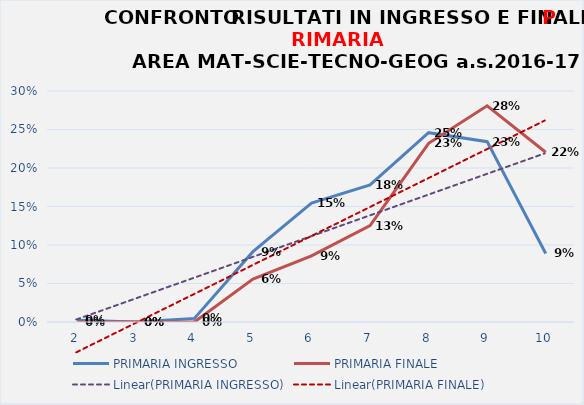
| Category | PRIMARIA INGRESSO | PRIMARIA FINALE |
|---|---|---|
| 2.0 | 0.002 | 0 |
| 3.0 | 0 | 0 |
| 4.0 | 0.005 | 0 |
| 5.0 | 0.091 | 0.056 |
| 6.0 | 0.155 | 0.086 |
| 7.0 | 0.178 | 0.125 |
| 8.0 | 0.246 | 0.232 |
| 9.0 | 0.234 | 0.281 |
| 10.0 | 0.089 | 0.22 |